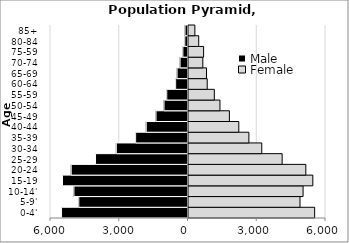
| Category | Male | Female |
|---|---|---|
| 0-4' | -5517.83 | 5504.49 |
| 5-9' | -4764.58 | 4865.94 |
| 10-14' | -4977.27 | 4999.89 |
| 15-19 | -5476.35 | 5424.67 |
| 20-24 | -5096.55 | 5119.49 |
| 25-29 | -4035.62 | 4086.37 |
| 30-34 | -3128.03 | 3197.19 |
| 35-39 | -2284.9 | 2635.09 |
| 40-44 | -1822.31 | 2195.09 |
| 45-49 | -1396.15 | 1784.88 |
| 50-54 | -1046.28 | 1372.87 |
| 55-59 | -926.79 | 1126.55 |
| 60-64 | -539.15 | 816.48 |
| 65-69 | -476.77 | 785.13 |
| 70-74 | -345.46 | 624.77 |
| 75-59 | -223.73 | 659.02 |
| 80-84 | -139.38 | 445.47 |
| 85+ | -130.65 | 277.84 |